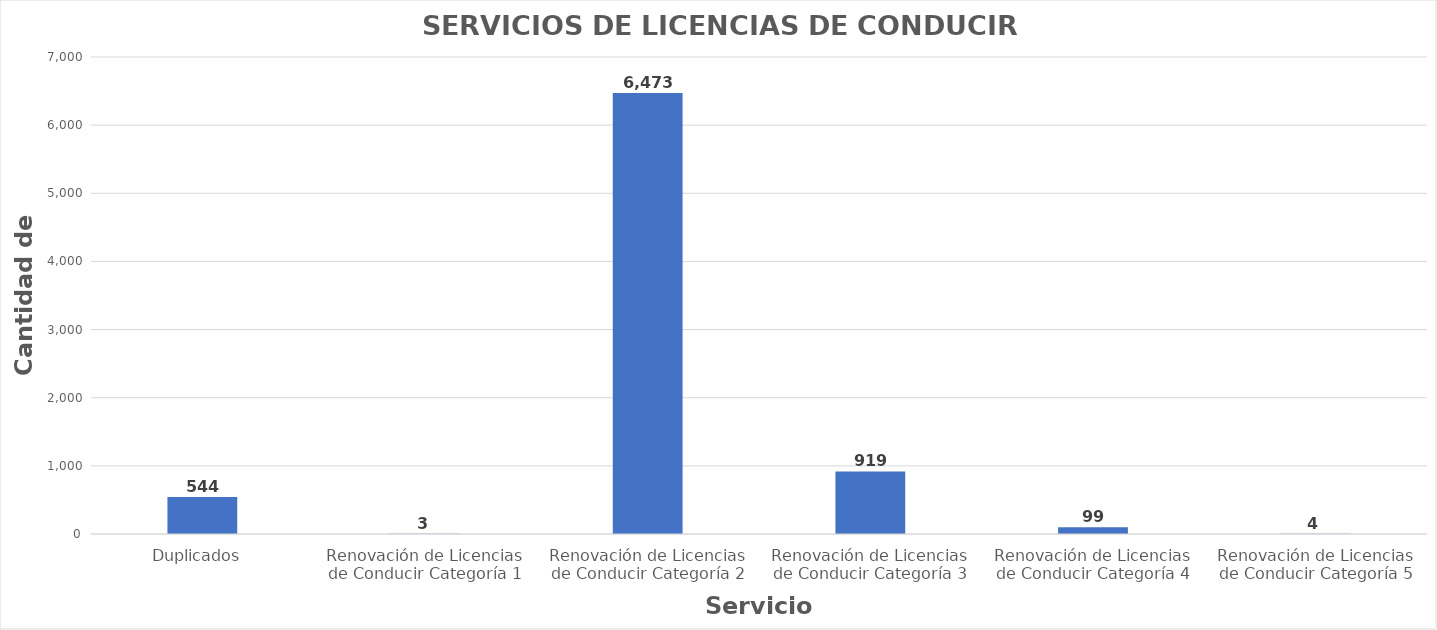
| Category | Series 0 |
|---|---|
| Duplicados  | 544 |
| Renovación de Licencias de Conducir Categoría 1 | 3 |
| Renovación de Licencias de Conducir Categoría 2 | 6473 |
| Renovación de Licencias de Conducir Categoría 3 | 919 |
| Renovación de Licencias de Conducir Categoría 4 | 99 |
| Renovación de Licencias de Conducir Categoría 5 | 4 |